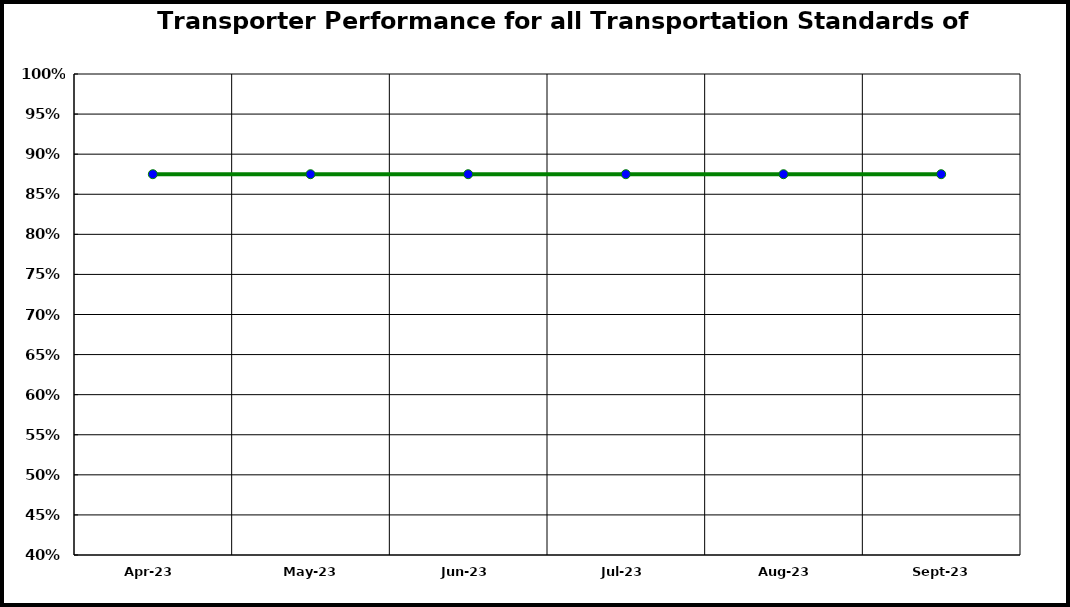
| Category | Performance |
|---|---|
| 2023-04-01 | 0.875 |
| 2023-05-01 | 0.875 |
| 2023-06-01 | 0.875 |
| 2023-07-01 | 0.875 |
| 2023-08-01 | 0.875 |
| 2023-09-01 | 0.875 |